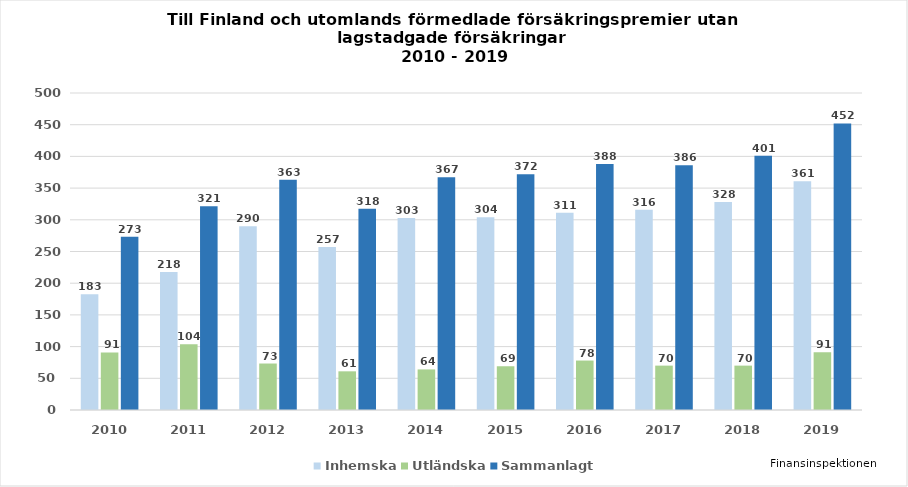
| Category | Inhemska | Utländska | Sammanlagt |
|---|---|---|---|
| 2010.0 | 182.562 | 90.729 | 273.291 |
| 2011.0 | 217.55 | 103.894 | 321.444 |
| 2012.0 | 289.922 | 73.321 | 363.243 |
| 2013.0 | 257 | 61 | 317.523 |
| 2014.0 | 303 | 64 | 367 |
| 2015.0 | 304 | 69 | 372 |
| 2016.0 | 311 | 78 | 388 |
| 2017.0 | 316 | 70 | 386 |
| 2018.0 | 328 | 70 | 401 |
| 2019.0 | 361 | 91 | 452 |